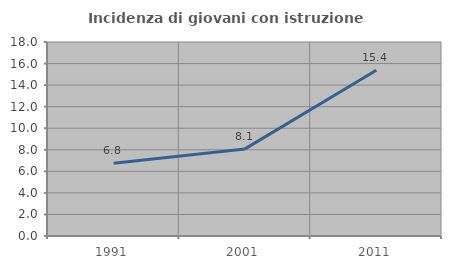
| Category | Incidenza di giovani con istruzione universitaria |
|---|---|
| 1991.0 | 6.757 |
| 2001.0 | 8.081 |
| 2011.0 | 15.385 |